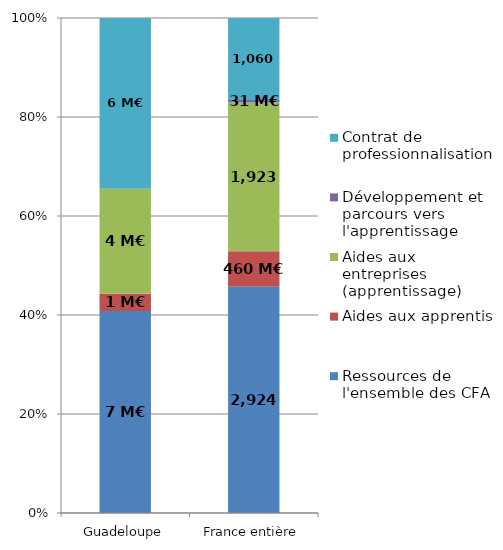
| Category | Ressources de l'ensemble des CFA | Aides aux apprentis | Aides aux entreprises (apprentissage) | Développement et parcours vers l'apprentissage | Contrat de professionnalisation |
|---|---|---|---|---|---|
| Guadeloupe | 7.441 | 0.641 | 3.864 | 0 | 6.293 |
| France entière | 2924.219 | 459.796 | 1923.184 | 31.421 | 1060.48 |